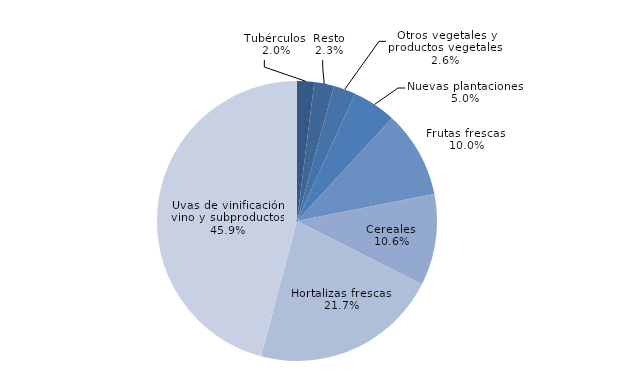
| Category | Series 0 |
|---|---|
| Tubérculos  | 9190.1 |
| Resto | 10556.98 |
| Otros vegetales y productos vegetales  | 11898.38 |
| Nuevas plantaciones  | 23440.08 |
| Frutas frescas  | 46610.76 |
| Cereales  | 48996.68 |
| Hortalizas frescas  | 100616.82 |
| Uvas de vinificación, vino y subproductos  | 212946.27 |